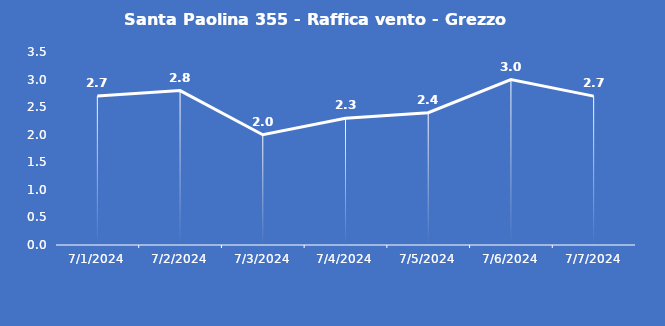
| Category | Santa Paolina 355 - Raffica vento - Grezzo (m/s) |
|---|---|
| 7/1/24 | 2.7 |
| 7/2/24 | 2.8 |
| 7/3/24 | 2 |
| 7/4/24 | 2.3 |
| 7/5/24 | 2.4 |
| 7/6/24 | 3 |
| 7/7/24 | 2.7 |